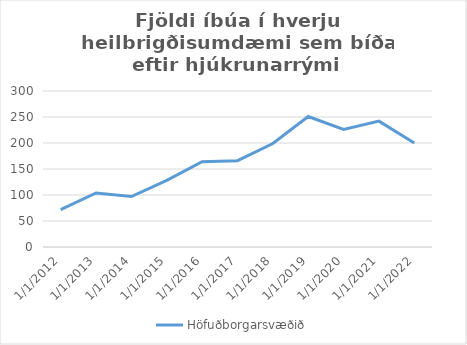
| Category | Höfuðborgarsvæðið |
|---|---|
| 1/1/12 | 72 |
| 1/1/13 | 104 |
| 1/1/14 | 97 |
| 1/1/15 | 128 |
| 1/1/16 | 164 |
| 1/1/17 | 166 |
| 1/1/18 | 199 |
| 1/1/19 | 251 |
| 1/1/20 | 226 |
| 1/1/21 | 242 |
| 1/1/22 | 200 |